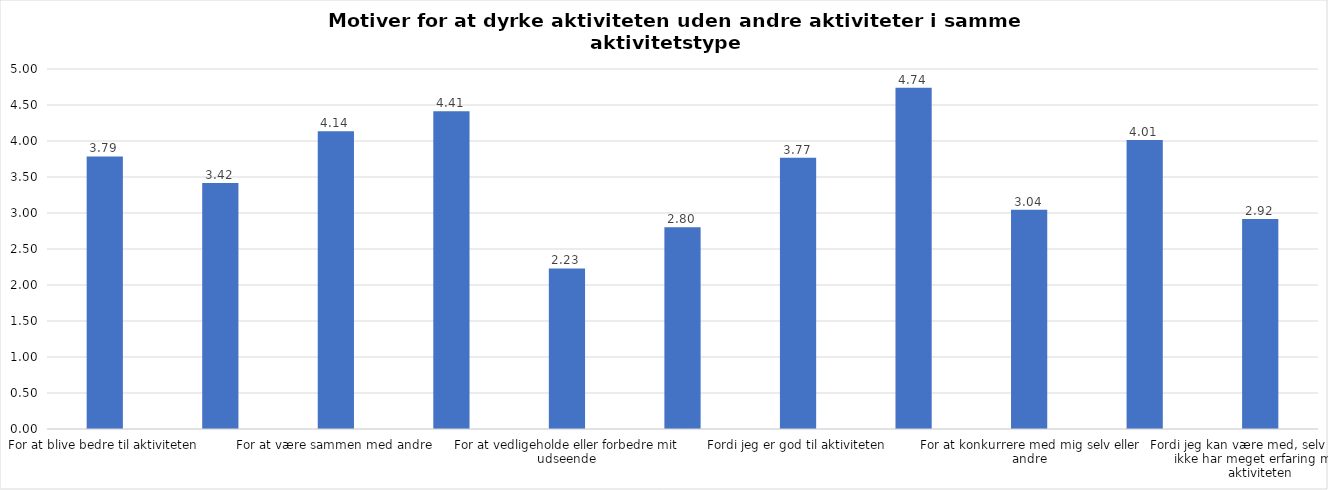
| Category | Gennemsnit |
|---|---|
| For at blive bedre til aktiviteten | 3.785 |
| For at vedligeholde eller forbedre min sundhed (fx helbred, fysisk form) | 3.417 |
| For at være sammen med andre | 4.136 |
| For at gøre noget godt for mig selv | 4.412 |
| For at vedligeholde eller forbedre mit udseende | 2.231 |
| Fordi andre i min omgangskreds opmuntrer mig til det | 2.802 |
| Fordi jeg er god til aktiviteten | 3.767 |
| Fordi jeg godt kan lide aktiviteten | 4.738 |
| For at konkurrere med mig selv eller andre | 3.044 |
| Fordi aktiviteten passer godt ind i min hverdag | 4.015 |
| Fordi jeg kan være med, selv om jeg ikke har meget erfaring med aktiviteten | 2.917 |